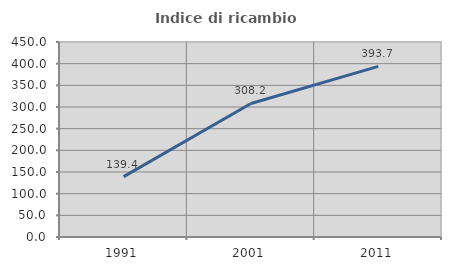
| Category | Indice di ricambio occupazionale  |
|---|---|
| 1991.0 | 139.416 |
| 2001.0 | 308.219 |
| 2011.0 | 393.651 |